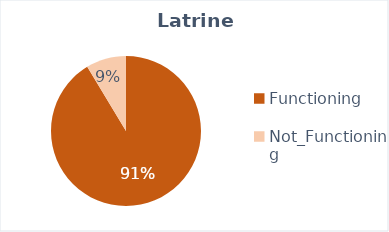
| Category | Series 0 |
|---|---|
| Functioning | 5021 |
| Not_Functioning | 475 |